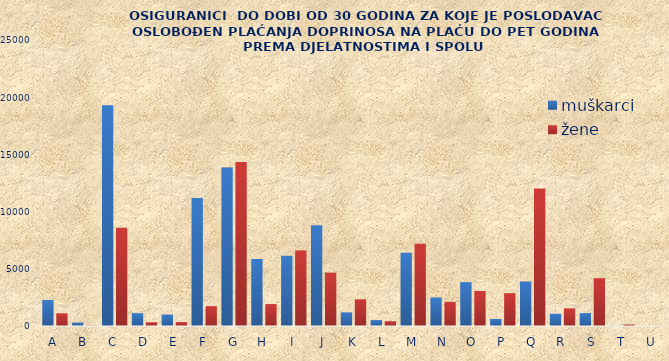
| Category | muškarci | žene |
|---|---|---|
| A | 2270 | 1111 |
| B | 296 | 31 |
| C | 19302 | 8581 |
| D | 1122 | 330 |
| E | 995 | 343 |
| F | 11188 | 1734 |
| G | 13849 | 14339 |
| H | 5857 | 1919 |
| I | 6135 | 6611 |
| J | 8797 | 4663 |
| K | 1192 | 2336 |
| L | 518 | 420 |
| M | 6404 | 7188 |
| N | 2495 | 2109 |
| O | 3835 | 3065 |
| P | 618 | 2869 |
| Q | 3883 | 12028 |
| R | 1065 | 1544 |
| S | 1130 | 4184 |
| T | 20 | 125 |
| U | 10 | 15 |